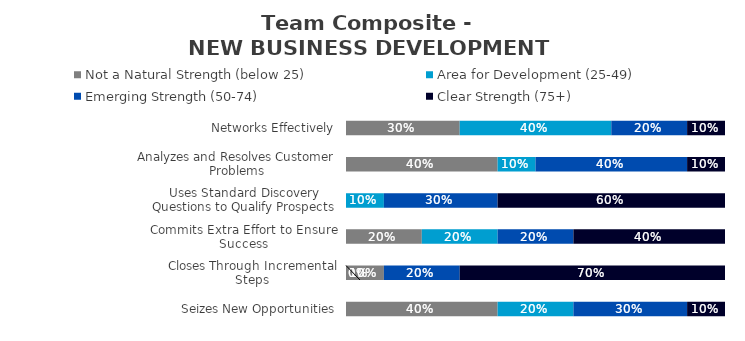
| Category | Not a Natural Strength (below 25) | Area for Development (25-49) | Emerging Strength (50-74) | Clear Strength (75+) |
|---|---|---|---|---|
| Networks Effectively | 0.3 | 0.4 | 0.2 | 0.1 |
| Analyzes and Resolves Customer Problems | 0.4 | 0.1 | 0.4 | 0.1 |
| Uses Standard Discovery Questions to Qualify Prospects | 0 | 0.1 | 0.3 | 0.6 |
| Commits Extra Effort to Ensure Success | 0.2 | 0.2 | 0.2 | 0.4 |
| Closes Through Incremental Steps | 0.1 | 0 | 0.2 | 0.7 |
| Seizes New Opportunities | 0.4 | 0.2 | 0.3 | 0.1 |